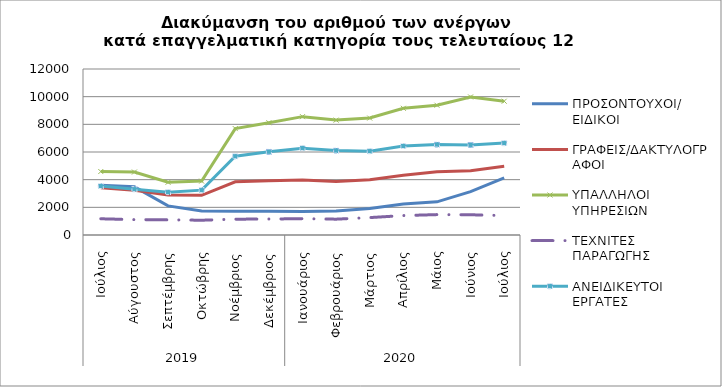
| Category | ΠΡΟΣΟΝΤΟΥΧΟΙ/  ΕΙΔΙΚΟΙ | ΓΡΑΦΕΙΣ/ΔΑΚΤΥΛΟΓΡΑΦΟΙ | ΥΠΑΛΛΗΛΟΙ ΥΠΗΡΕΣΙΩΝ | ΤΕΧΝΙΤΕΣ ΠΑΡΑΓΩΓΗΣ | ΑΝΕΙΔΙΚΕΥΤΟΙ ΕΡΓΑΤΕΣ |
|---|---|---|---|---|---|
| 0 | 3596 | 3417 | 4589 | 1173 | 3539 |
| 1 | 3481 | 3236 | 4551 | 1111 | 3312 |
| 2 | 2104 | 2890 | 3809 | 1097 | 3094 |
| 3 | 1735 | 2865 | 3896 | 1068 | 3242 |
| 4 | 1719 | 3843 | 7692 | 1144 | 5690 |
| 5 | 1724 | 3914 | 8117 | 1155 | 6012 |
| 6 | 1702 | 3980 | 8556 | 1179 | 6279 |
| 7 | 1728 | 3859 | 8305 | 1145 | 6104 |
| 8 | 1918 | 4001 | 8454 | 1258 | 6062 |
| 9 | 2246 | 4325 | 9159 | 1405 | 6433 |
| 10 | 2398 | 4567 | 9381 | 1474 | 6537 |
| 11 | 3138 | 4651 | 9981 | 1463 | 6510 |
| 12 | 4130 | 4971 | 9672 | 1404 | 6642 |